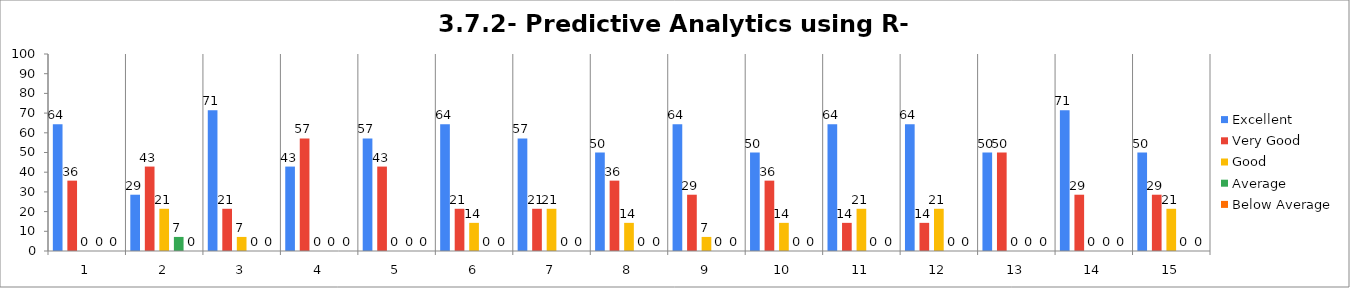
| Category | Excellent | Very Good | Good | Average | Below Average |
|---|---|---|---|---|---|
| 0 | 64.286 | 35.714 | 0 | 0 | 0 |
| 1 | 28.571 | 42.857 | 21.429 | 7.143 | 0 |
| 2 | 71.429 | 21.429 | 7.143 | 0 | 0 |
| 3 | 42.857 | 57.143 | 0 | 0 | 0 |
| 4 | 57.143 | 42.857 | 0 | 0 | 0 |
| 5 | 64.286 | 21.429 | 14.286 | 0 | 0 |
| 6 | 57.143 | 21.429 | 21.429 | 0 | 0 |
| 7 | 50 | 35.714 | 14.286 | 0 | 0 |
| 8 | 64.286 | 28.571 | 7.143 | 0 | 0 |
| 9 | 50 | 35.714 | 14.286 | 0 | 0 |
| 10 | 64.286 | 14.286 | 21.429 | 0 | 0 |
| 11 | 64.286 | 14.286 | 21.429 | 0 | 0 |
| 12 | 50 | 50 | 0 | 0 | 0 |
| 13 | 71.429 | 28.571 | 0 | 0 | 0 |
| 14 | 50 | 28.571 | 21.429 | 0 | 0 |